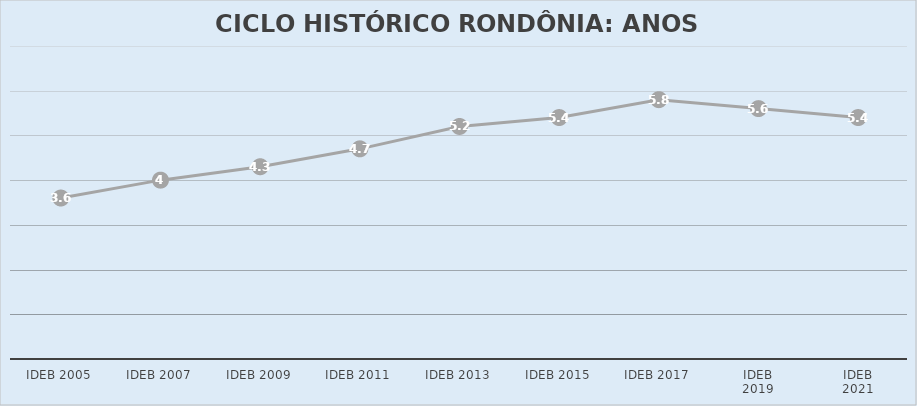
| Category | Series 0 | Series 1 | RONDÔNIA |
|---|---|---|---|
| IDEB 2005 |  |  | 3.6 |
| IDEB 2007 |  |  | 4 |
| IDEB 2009 |  |  | 4.3 |
| IDEB 2011 |  |  | 4.7 |
| IDEB 2013 |  |  | 5.2 |
| IDEB 2015 |  |  | 5.4 |
| IDEB 2017 |  |  | 5.8 |
| IDEB
2019 |  |  | 5.6 |
| IDEB
2021 |  |  | 5.4 |